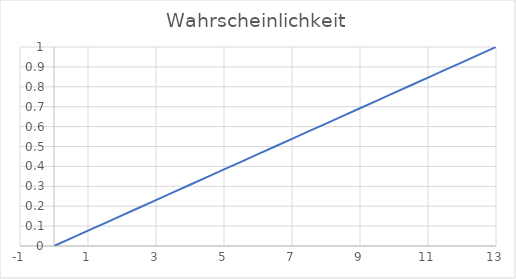
| Category | Series 0 |
|---|---|
| 0.0 | 0 |
| 1.0 | 0.077 |
| 2.0 | 0.154 |
| 3.0 | 0.231 |
| 4.0 | 0.308 |
| 5.0 | 0.385 |
| 6.0 | 0.462 |
| 7.0 | 0.538 |
| 8.0 | 0.615 |
| 9.0 | 0.692 |
| 10.0 | 0.769 |
| 11.0 | 0.846 |
| 12.0 | 0.923 |
| 13.0 | 1 |